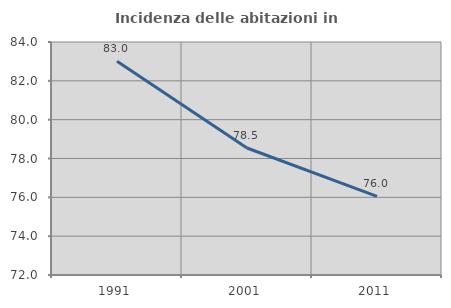
| Category | Incidenza delle abitazioni in proprietà  |
|---|---|
| 1991.0 | 83.006 |
| 2001.0 | 78.542 |
| 2011.0 | 76.047 |